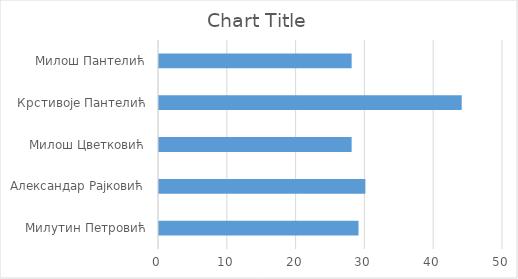
| Category | Series 0 |
|---|---|
| Милутин Петровић | 29 |
| Александар Рајковић | 30 |
| Милош Цветковић | 28 |
| Крстивоје Пантелић | 44 |
| Милош Пантелић | 28 |